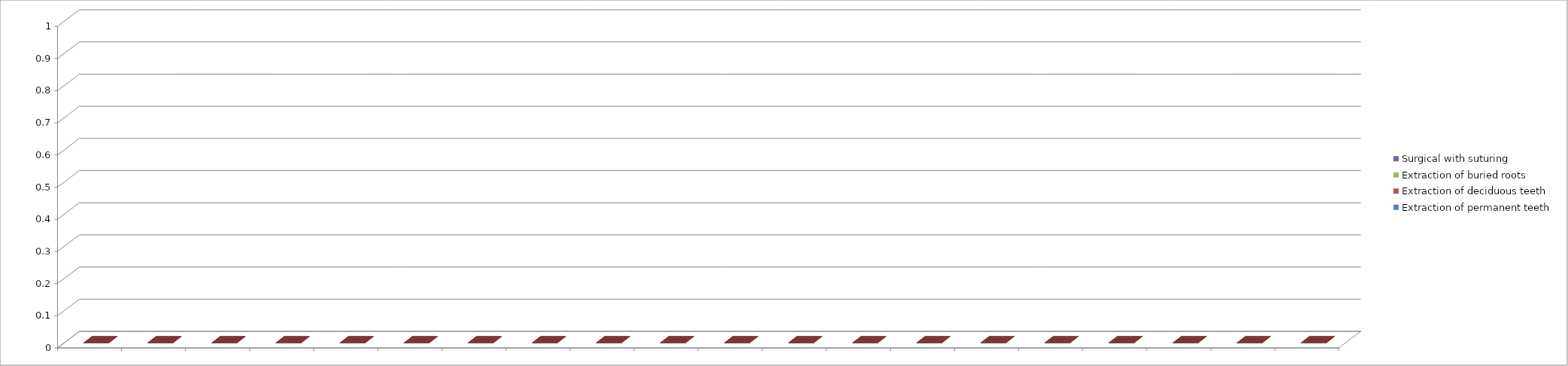
| Category | Extraction of permanent teeth | Extraction of deciduous teeth | Extraction of buried roots | Surgical with suturing |
|---|---|---|---|---|
| 0 | 0 | 0 | 0 | 0 |
| 1 | 0 | 0 | 0 | 0 |
| 2 | 0 | 0 | 0 | 0 |
| 3 | 0 | 0 | 0 | 0 |
| 4 | 0 | 0 | 0 | 0 |
| 5 | 0 | 0 | 0 | 0 |
| 6 | 0 | 0 | 0 | 0 |
| 7 | 0 | 0 | 0 | 0 |
| 8 | 0 | 0 | 0 | 0 |
| 9 | 0 | 0 | 0 | 0 |
| 10 | 0 | 0 | 0 | 0 |
| 11 | 0 | 0 | 0 | 0 |
| 12 | 0 | 0 | 0 | 0 |
| 13 | 0 | 0 | 0 | 0 |
| 14 | 0 | 0 | 0 | 0 |
| 15 | 0 | 0 | 0 | 0 |
| 16 | 0 | 0 | 0 | 0 |
| 17 | 0 | 0 | 0 | 0 |
| 18 | 0 | 0 | 0 | 0 |
| 19 | 0 | 0 | 0 | 0 |